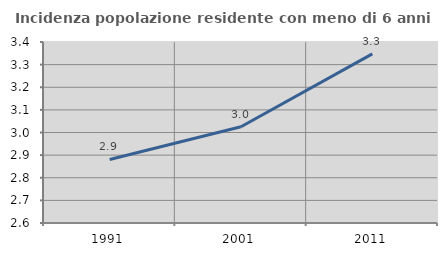
| Category | Incidenza popolazione residente con meno di 6 anni |
|---|---|
| 1991.0 | 2.881 |
| 2001.0 | 3.026 |
| 2011.0 | 3.347 |